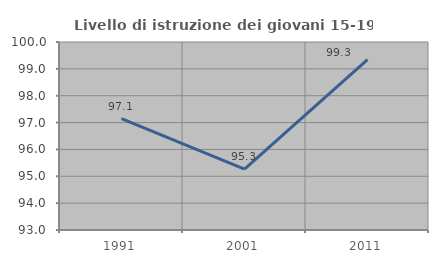
| Category | Livello di istruzione dei giovani 15-19 anni |
|---|---|
| 1991.0 | 97.143 |
| 2001.0 | 95.266 |
| 2011.0 | 99.346 |